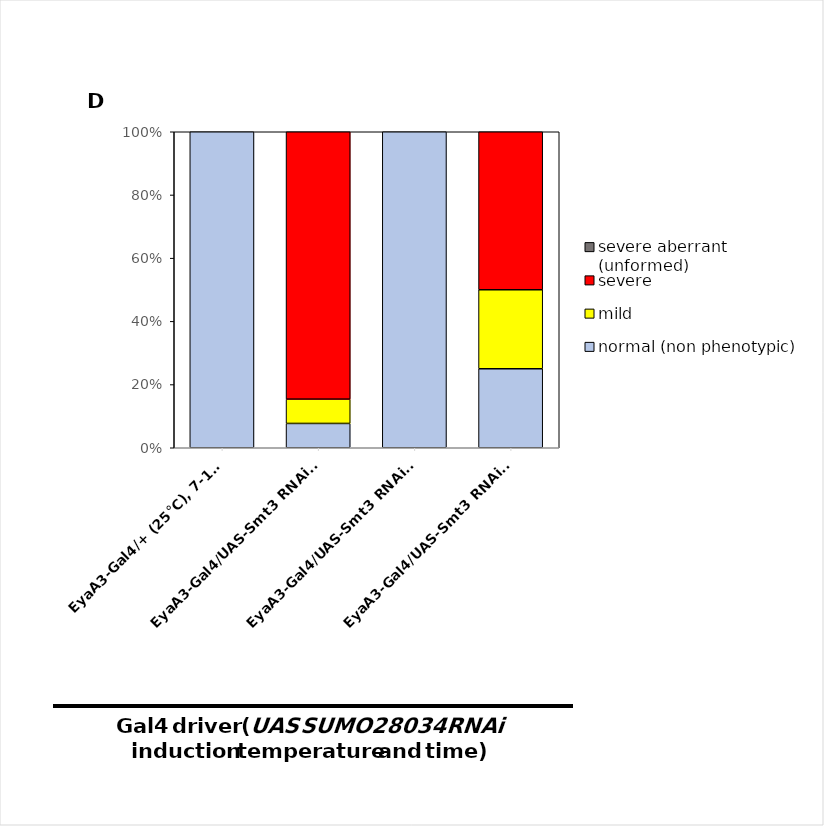
| Category | normal (non phenotypic) | mild | severe | severe aberrant (unformed) |
|---|---|---|---|---|
| EyaA3-Gal4/+ (25°C), 7-10 d | 36 | 0 | 0 | 0 |
| EyaA3-Gal4/UAS-Smt3 RNAi (25°C), 6-10 d | 1 | 1 | 11 | 0 |
| EyaA3-Gal4/UAS-Smt3 RNAi (18-25°C), 1-3 d | 8 | 0 | 0 | 0 |
| EyaA3-Gal4/UAS-Smt3 RNAi (18-25°C), 7-10 d | 1 | 1 | 2 | 0 |